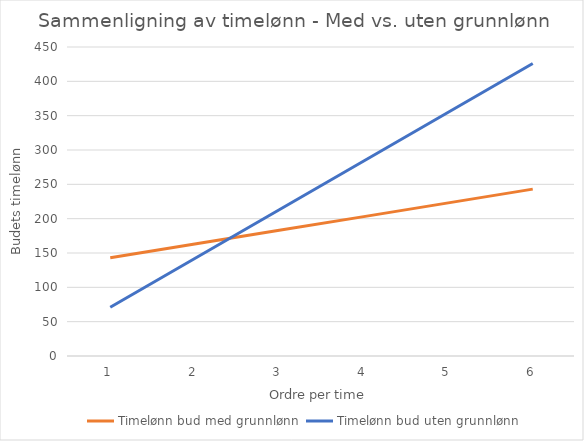
| Category | Timelønn bud med grunnlønn | Timelønn bud uten grunnlønn |
|---|---|---|
| 0 | 143 | 71 |
| 1 | 163 | 142 |
| 2 | 183 | 213 |
| 3 | 203 | 284 |
| 4 | 223 | 355 |
| 5 | 243 | 426 |